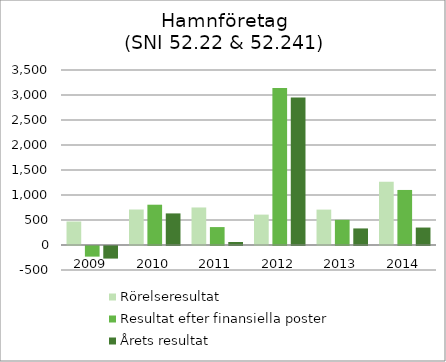
| Category | Rörelseresultat | Resultat efter finansiella poster | Årets resultat |
|---|---|---|---|
| 2009.0 | 470.155 | -212.41 | -251.737 |
| 2010.0 | 709.801 | 805.844 | 631.87 |
| 2011.0 | 750.551 | 358.3 | 60.482 |
| 2012.0 | 607.815 | 3138.647 | 2949.896 |
| 2013.0 | 707.936 | 503.546 | 331.395 |
| 2014.0 | 1262.596 | 1100.869 | 349.191 |